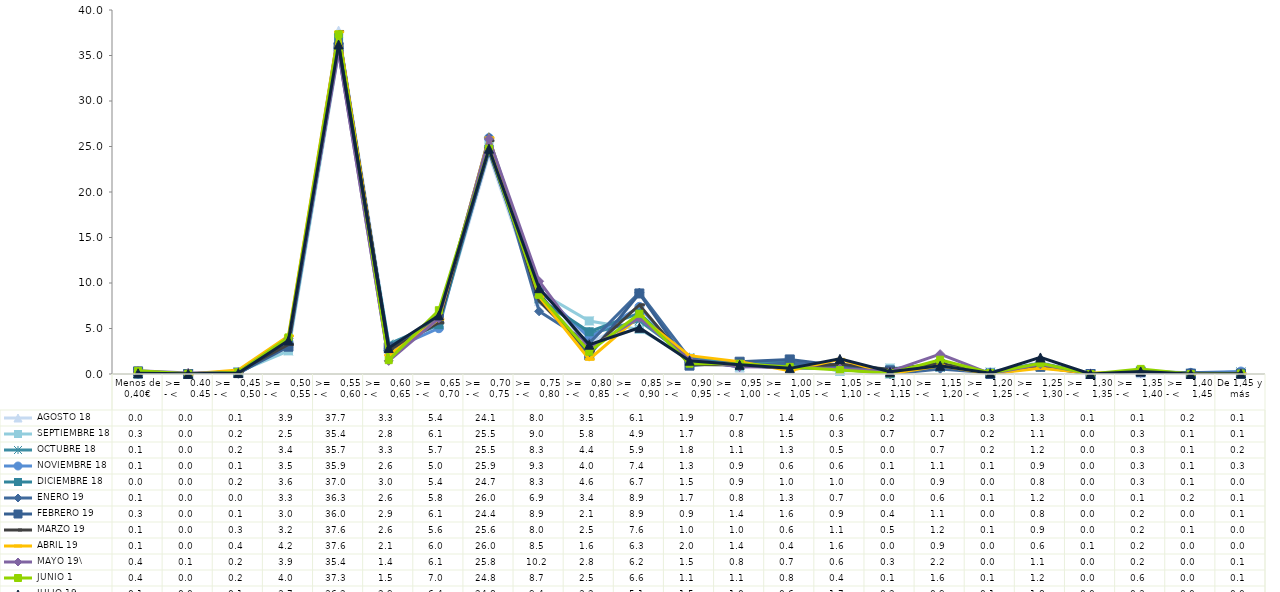
| Category |  AGOSTO 18 |  SEPTIEMBRE 18 |  OCTUBRE 18 |  NOVIEMBRE 18 |  DICIEMBRE 18 |  ENERO 19 |  FEBRERO 19 |  MARZO 19 |  ABRIL 19 |  MAYO 19\ |  JUNIO 1 |  JULIO 19 |
|---|---|---|---|---|---|---|---|---|---|---|---|---|
| Menos de 0,40€ | 0 | 0.25 | 0.1 | 0.05 | 0.01 | 0.1 | 0.29 | 0.09 | 0.09 | 0.35 | 0.35 | 0.08 |
| >=   0.40 - <    0.45 | 0.03 | 0 | 0.01 | 0 | 0 | 0 | 0 | 0 | 0 | 0.12 | 0.03 | 0.02 |
| >=   0,45 - <    0,50 | 0.14 | 0.21 | 0.19 | 0.09 | 0.2 | 0.03 | 0.11 | 0.29 | 0.44 | 0.19 | 0.2 | 0.1 |
| >=   0,50 - <    0,55 | 3.89 | 2.54 | 3.44 | 3.54 | 3.58 | 3.27 | 3 | 3.24 | 4.18 | 3.91 | 4.02 | 3.69 |
| >=   0,55 - <    0,60 | 37.74 | 35.37 | 35.74 | 35.88 | 36.98 | 36.32 | 35.95 | 37.64 | 37.59 | 35.38 | 37.32 | 36.21 |
| >=   0,60 - <    0,65 | 3.34 | 2.77 | 3.29 | 2.58 | 2.99 | 2.57 | 2.94 | 2.64 | 2.07 | 1.44 | 1.52 | 2.85 |
| >=   0,65 - <   0,70 | 5.41 | 6.08 | 5.72 | 5.03 | 5.42 | 5.82 | 6.09 | 5.62 | 6.01 | 6.12 | 7.01 | 6.44 |
| >=   0,70 - <   0,75 | 24.12 | 25.47 | 25.54 | 25.93 | 24.67 | 26 | 24.44 | 25.64 | 25.95 | 25.83 | 24.76 | 24.76 |
| >=   0,75 - <   0,80 | 8 | 9.02 | 8.28 | 9.27 | 8.26 | 6.89 | 8.9 | 8.04 | 8.5 | 10.19 | 8.7 | 9.43 |
| >=   0,80 - <   0,85 | 3.45 | 5.83 | 4.41 | 3.96 | 4.64 | 3.39 | 2.06 | 2.5 | 1.62 | 2.81 | 2.45 | 3.22 |
| >=   0,85 - <   0,90 | 6.11 | 4.91 | 5.85 | 7.38 | 6.69 | 8.94 | 8.85 | 7.6 | 6.33 | 6.18 | 6.62 | 5.08 |
| >=   0,90 - <    0,95 | 1.86 | 1.74 | 1.78 | 1.25 | 1.51 | 1.7 | 0.92 | 1.03 | 2.02 | 1.54 | 1.13 | 1.46 |
| >=   0,95 - <   1,00 | 0.7 | 0.79 | 1.13 | 0.94 | 0.91 | 0.78 | 1.35 | 0.99 | 1.36 | 0.79 | 1.13 | 1.01 |
| >=   1,00 - <   1,05 | 1.35 | 1.5 | 1.32 | 0.62 | 0.98 | 1.25 | 1.6 | 0.6 | 0.37 | 0.73 | 0.78 | 0.62 |
| >=   1,05 - <    1,10 | 0.58 | 0.29 | 0.53 | 0.61 | 1 | 0.72 | 0.9 | 1.11 | 1.61 | 0.59 | 0.43 | 1.66 |
| >=   1,10 - <   1,15 | 0.23 | 0.65 | 0.03 | 0.13 | 0.02 | 0 | 0.4 | 0.49 | 0.02 | 0.29 | 0.09 | 0.24 |
| >=   1,15 - <    1,20 | 1.07 | 0.74 | 0.72 | 1.09 | 0.92 | 0.55 | 1.09 | 1.19 | 0.9 | 2.18 | 1.57 | 0.9 |
| >=   1,20 - <    1,25 | 0.26 | 0.2 | 0.18 | 0.1 | 0.02 | 0.13 | 0.02 | 0.05 | 0.03 | 0.04 | 0.11 | 0.08 |
| >=   1,25 - <    1,30 | 1.28 | 1.14 | 1.17 | 0.87 | 0.78 | 1.17 | 0.8 | 0.9 | 0.63 | 1.07 | 1.18 | 1.82 |
| >=   1,30 - <    1,35 | 0.09 | 0.04 | 0.01 | 0.01 | 0 | 0 | 0 | 0 | 0.1 | 0.04 | 0 | 0 |
| >=   1,35 - <    1,40 | 0.08 | 0.3 | 0.27 | 0.27 | 0.34 | 0.13 | 0.21 | 0.22 | 0.18 | 0.17 | 0.56 | 0.28 |
| >=   1,40 - <    1,45 | 0.16 | 0.07 | 0.06 | 0.13 | 0.05 | 0.16 | 0.04 | 0.05 | 0 | 0 | 0 | 0 |
| De 1,45 y más | 0.12 | 0.09 | 0.23 | 0.27 | 0.04 | 0.07 | 0.05 | 0.04 | 0.03 | 0.07 | 0.05 | 0.04 |